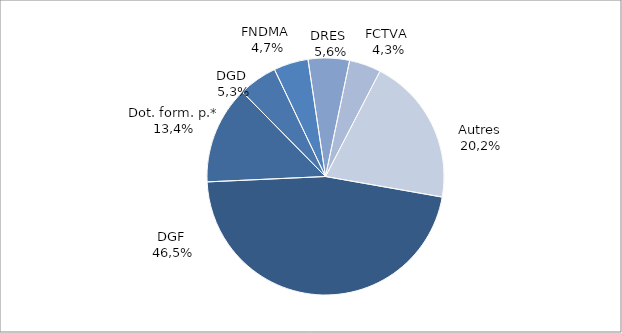
| Category | Series 0 |
|---|---|
| DGF | 0.465 |
| Dot. form. p.* | 0.134 |
| DGD | 0.053 |
| FNDMA | 0.047 |
| DRES | 0.056 |
| FCTVA | 0.043 |
| Autres | 0.202 |